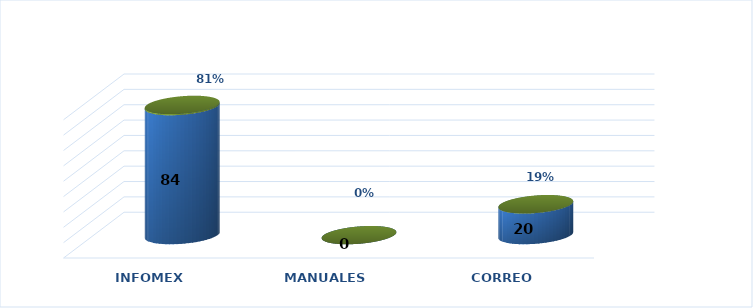
| Category | Series 0 | Series 1 |
|---|---|---|
| INFOMEX | 84 | 0.808 |
| MANUALES | 0 | 0 |
| CORREO | 20 | 0.192 |